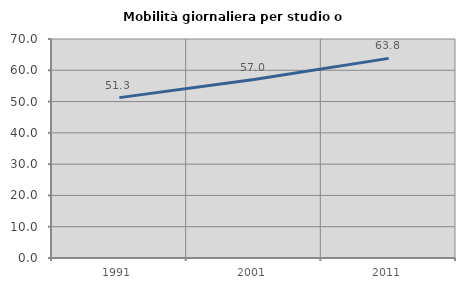
| Category | Mobilità giornaliera per studio o lavoro |
|---|---|
| 1991.0 | 51.259 |
| 2001.0 | 57.037 |
| 2011.0 | 63.806 |